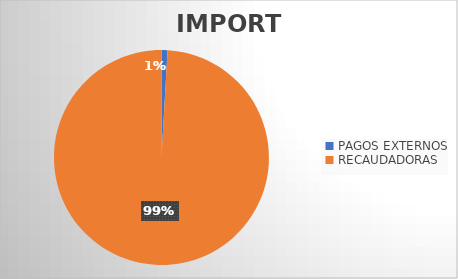
| Category | IMPORTE |
|---|---|
| PAGOS EXTERNOS | 1697054.63 |
| RECAUDADORAS | 186795515.27 |